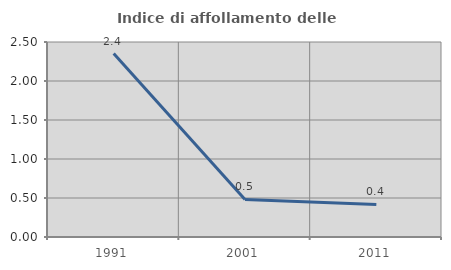
| Category | Indice di affollamento delle abitazioni  |
|---|---|
| 1991.0 | 2.351 |
| 2001.0 | 0.482 |
| 2011.0 | 0.418 |